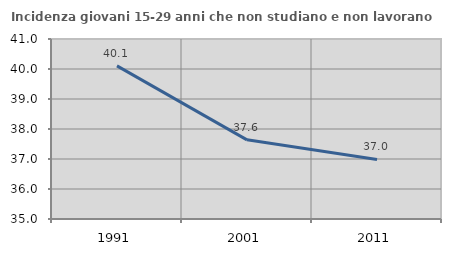
| Category | Incidenza giovani 15-29 anni che non studiano e non lavorano  |
|---|---|
| 1991.0 | 40.104 |
| 2001.0 | 37.639 |
| 2011.0 | 36.986 |